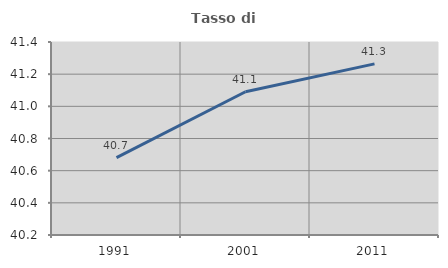
| Category | Tasso di occupazione   |
|---|---|
| 1991.0 | 40.681 |
| 2001.0 | 41.091 |
| 2011.0 | 41.264 |